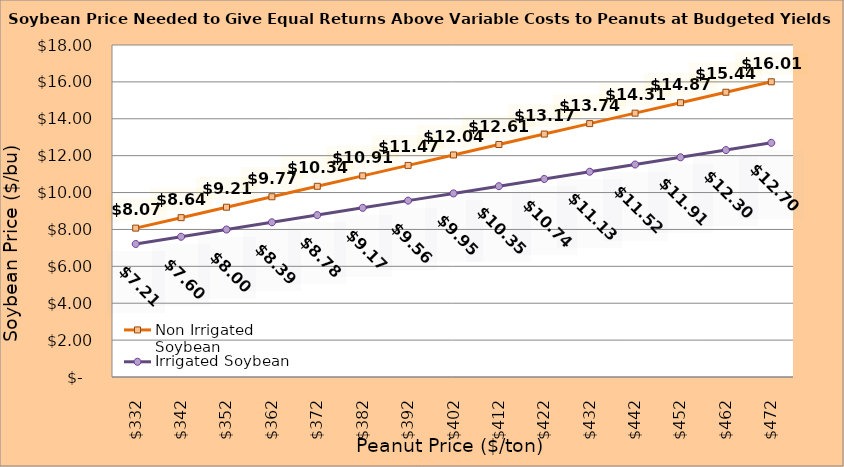
| Category | Non Irrigated Soybean | Irrigated Soybean |
|---|---|---|
| 332.02127659574467 | 8.072 | 7.212 |
| 342.02127659574467 | 8.639 | 7.604 |
| 352.02127659574467 | 9.205 | 7.996 |
| 362.02127659574467 | 9.772 | 8.387 |
| 372.02127659574467 | 10.339 | 8.779 |
| 382.02127659574467 | 10.905 | 9.171 |
| 392.02127659574467 | 11.472 | 9.562 |
| 402.02127659574467 | 12.039 | 9.954 |
| 412.02127659574467 | 12.605 | 10.346 |
| 422.02127659574467 | 13.172 | 10.737 |
| 432.02127659574467 | 13.739 | 11.129 |
| 442.02127659574467 | 14.305 | 11.521 |
| 452.02127659574467 | 14.872 | 11.912 |
| 462.02127659574467 | 15.439 | 12.304 |
| 472.02127659574467 | 16.005 | 12.696 |